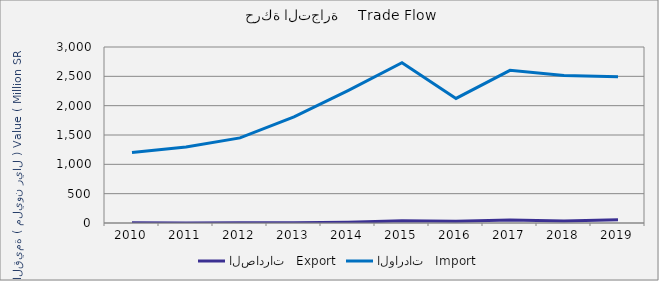
| Category | الصادرات   Export | الواردات   Import |
|---|---|---|
| 2010.0 | 2459319 | 1202656334 |
| 2011.0 | 2113955 | 1293961497 |
| 2012.0 | 4423342 | 1451208981 |
| 2013.0 | 3193641 | 1807615404 |
| 2014.0 | 13449745 | 2257369487 |
| 2015.0 | 36644808 | 2732469288 |
| 2016.0 | 28573209 | 2123836111 |
| 2017.0 | 50631808 | 2601681419 |
| 2018.0 | 33138063 | 2514896460 |
| 2019.0 | 56140410 | 2491014643 |